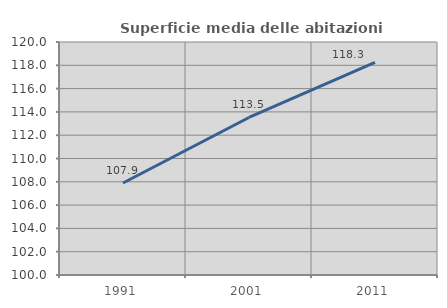
| Category | Superficie media delle abitazioni occupate |
|---|---|
| 1991.0 | 107.897 |
| 2001.0 | 113.521 |
| 2011.0 | 118.25 |